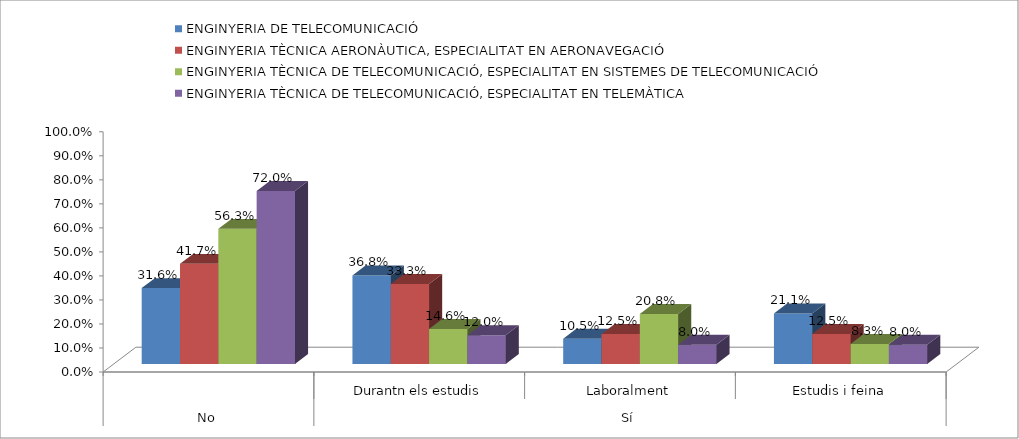
| Category | ENGINYERIA DE TELECOMUNICACIÓ | ENGINYERIA TÈCNICA AERONÀUTICA, ESPECIALITAT EN AERONAVEGACIÓ | ENGINYERIA TÈCNICA DE TELECOMUNICACIÓ, ESPECIALITAT EN SISTEMES DE TELECOMUNICACIÓ | ENGINYERIA TÈCNICA DE TELECOMUNICACIÓ, ESPECIALITAT EN TELEMÀTICA |
|---|---|---|---|---|
| 0 | 0.316 | 0.417 | 0.562 | 0.72 |
| 1 | 0.368 | 0.333 | 0.146 | 0.12 |
| 2 | 0.105 | 0.125 | 0.208 | 0.08 |
| 3 | 0.211 | 0.125 | 0.083 | 0.08 |